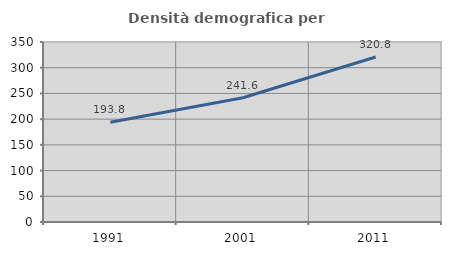
| Category | Densità demografica |
|---|---|
| 1991.0 | 193.825 |
| 2001.0 | 241.623 |
| 2011.0 | 320.848 |